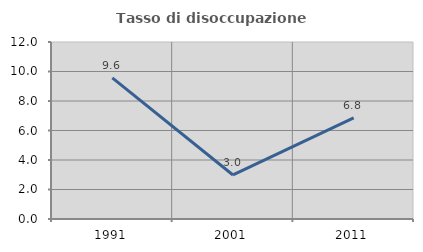
| Category | Tasso di disoccupazione giovanile  |
|---|---|
| 1991.0 | 9.565 |
| 2001.0 | 2.985 |
| 2011.0 | 6.849 |